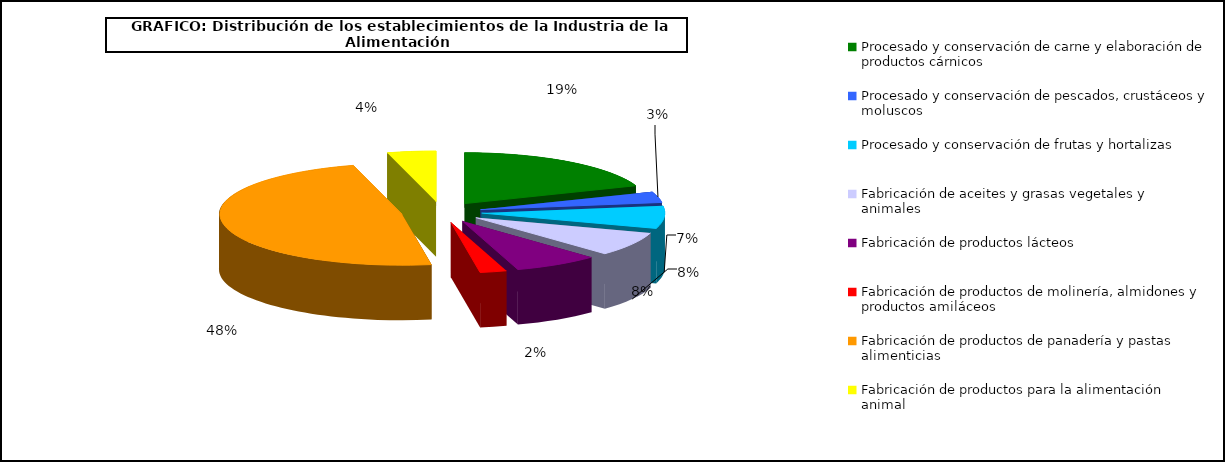
| Category | Series 0 |
|---|---|
| Procesado y conservación de carne y elaboración de productos cárnicos | 4626 |
| Procesado y conservación de pescados, crustáceos y moluscos | 837 |
| Procesado y conservación de frutas y hortalizas | 1715 |
| Fabricación de aceites y grasas vegetales y animales | 1841 |
| Fabricación de productos lácteos | 1809 |
| Fabricación de productos de molinería, almidones y productos amiláceos | 564 |
| Fabricación de productos de panadería y pastas alimenticias | 11585 |
| Fabricación de productos para la alimentación animal | 1033 |